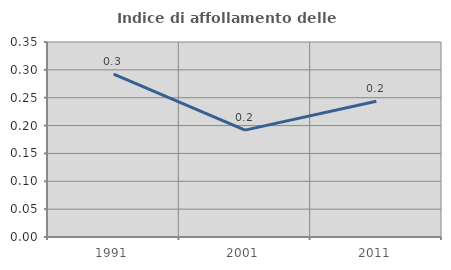
| Category | Indice di affollamento delle abitazioni  |
|---|---|
| 1991.0 | 0.292 |
| 2001.0 | 0.192 |
| 2011.0 | 0.244 |